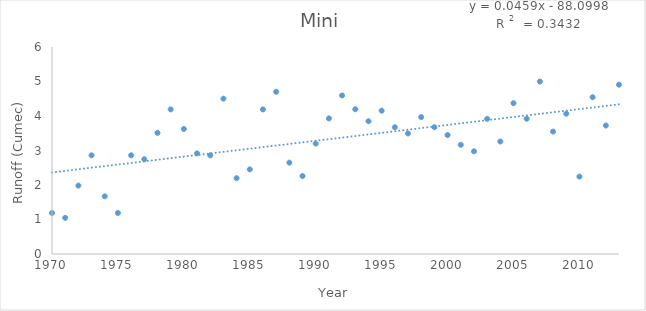
| Category | Mini |
|---|---|
| 1970.0 | 1.189 |
| 1971.0 | 1.048 |
| 1972.0 | 1.982 |
| 1973.0 | 2.86 |
| 1974.0 | 1.671 |
| 1975.0 | 1.189 |
| 1976.0 | 2.86 |
| 1977.0 | 2.747 |
| 1978.0 | 3.512 |
| 1979.0 | 4.191 |
| 1980.0 | 3.625 |
| 1981.0 | 2.917 |
| 1982.0 | 2.86 |
| 1983.0 | 4.503 |
| 1984.0 | 2.198 |
| 1985.0 | 2.453 |
| 1986.0 | 4.191 |
| 1987.0 | 4.701 |
| 1988.0 | 2.648 |
| 1989.0 | 2.26 |
| 1990.0 | 3.2 |
| 1991.0 | 3.93 |
| 1992.0 | 4.596 |
| 1993.0 | 4.197 |
| 1994.0 | 3.849 |
| 1995.0 | 4.154 |
| 1996.0 | 3.674 |
| 1997.0 | 3.495 |
| 1998.0 | 3.968 |
| 1999.0 | 3.676 |
| 2000.0 | 3.449 |
| 2001.0 | 3.165 |
| 2002.0 | 2.977 |
| 2003.0 | 3.917 |
| 2004.0 | 3.261 |
| 2005.0 | 4.372 |
| 2006.0 | 3.921 |
| 2007.0 | 4.999 |
| 2008.0 | 3.548 |
| 2009.0 | 4.067 |
| 2010.0 | 2.243 |
| 2011.0 | 4.545 |
| 2012.0 | 3.724 |
| 2013.0 | 4.907 |